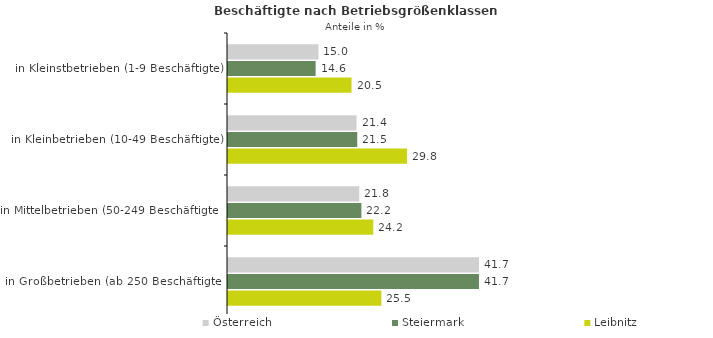
| Category | Österreich | Steiermark | Leibnitz |
|---|---|---|---|
| in Kleinstbetrieben (1-9 Beschäftigte) | 15.046 | 14.574 | 20.546 |
| in Kleinbetrieben (10-49 Beschäftigte) | 21.375 | 21.498 | 29.786 |
| in Mittelbetrieben (50-249 Beschäftigte) | 21.831 | 22.187 | 24.161 |
| in Großbetrieben (ab 250 Beschäftigte) | 41.748 | 41.742 | 25.506 |